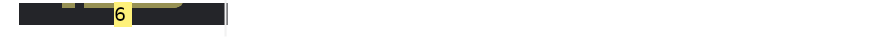
| Category | Summe von Ziel | Summe von Ist |
|---|---|---|
| Ergebnis | 6 | 6 |